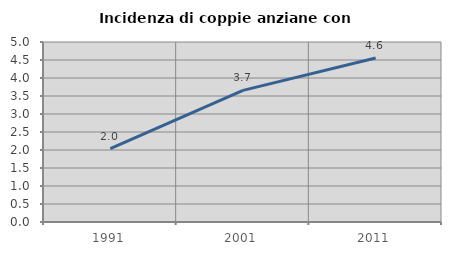
| Category | Incidenza di coppie anziane con figli |
|---|---|
| 1991.0 | 2.036 |
| 2001.0 | 3.657 |
| 2011.0 | 4.555 |